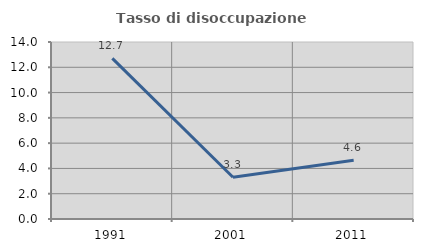
| Category | Tasso di disoccupazione giovanile  |
|---|---|
| 1991.0 | 12.702 |
| 2001.0 | 3.303 |
| 2011.0 | 4.644 |